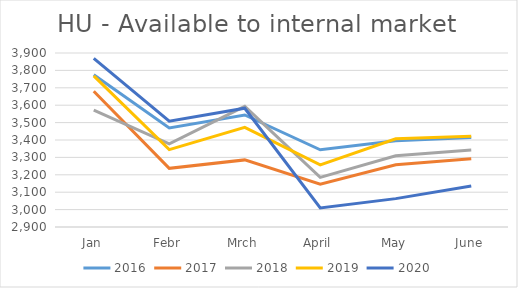
| Category | 2016 | 2017 | 2018 | 2019 | 2020 |
|---|---|---|---|---|---|
| Jan | 3775 | 3680.027 | 3571.442 | 3768.568 | 3869.324 |
| Febr | 3469 | 3237.214 | 3377.766 | 3344.633 | 3508.575 |
| Mrch | 3544 | 3285.658 | 3593.599 | 3472.86 | 3582.64 |
| April | 3344 | 3145.458 | 3185.476 | 3257.101 | 3009.901 |
| May | 3396 | 3257.216 | 3309.029 | 3406.958 | 3063.06 |
| June | 3415 | 3291.767 | 3342.415 | 3421.675 | 3135.956 |